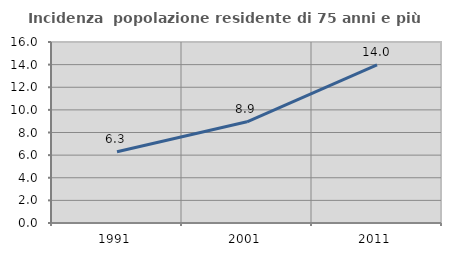
| Category | Incidenza  popolazione residente di 75 anni e più |
|---|---|
| 1991.0 | 6.3 |
| 2001.0 | 8.943 |
| 2011.0 | 13.974 |